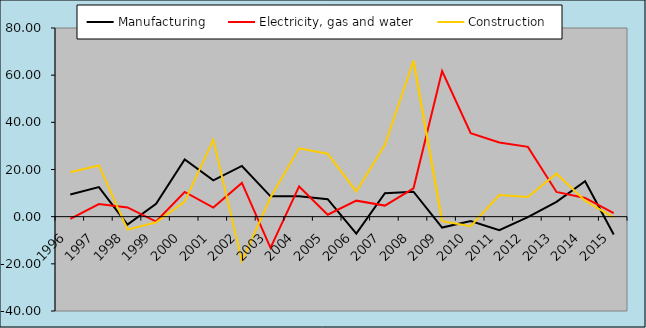
| Category | Manufacturing | Electricity, gas and water | Construction |
|---|---|---|---|
| 1996.0 | 9.389 | -0.894 | 18.856 |
| 1997.0 | 12.516 | 5.366 | 21.718 |
| 1998.0 | -3.365 | 3.908 | -5.506 |
| 1999.0 | 5.443 | -2.075 | -2.393 |
| 2000.0 | 24.236 | 10.475 | 6.402 |
| 2001.0 | 15.39 | 3.87 | 32.643 |
| 2002.0 | 21.509 | 14.323 | -18.892 |
| 2003.0 | 8.627 | -13.25 | 8.131 |
| 2004.0 | 8.688 | 12.821 | 29.01 |
| 2005.0 | 7.397 | 0.829 | 26.668 |
| 2006.0 | -7.214 | 6.787 | 10.697 |
| 2007.0 | 9.951 | 4.697 | 30.465 |
| 2008.0 | 10.575 | 12.015 | 66.109 |
| 2009.0 | -4.603 | 61.778 | -1.915 |
| 2010.0 | -1.88 | 35.358 | -4.045 |
| 2011.0 | -5.704 | 31.46 | 9.201 |
| 2012.0 | -0.183 | 29.6 | 8.376 |
| 2013.0 | 6.305 | 10.479 | 18.22 |
| 2014.0 | 15.057 | 7.936 | 6.774 |
| 2015.0 | -7.596 | 1.495 | -0.406 |